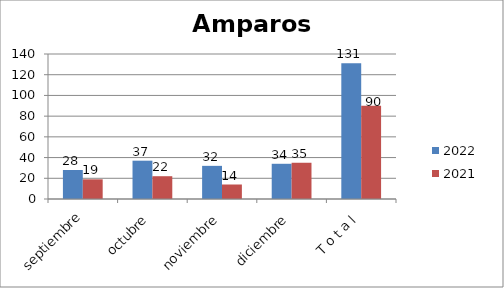
| Category | 2022 | 2021 |
|---|---|---|
| septiembre | 28 | 19 |
| octubre | 37 | 22 |
| noviembre | 32 | 14 |
| diciembre | 34 | 35 |
| T o t a l | 131 | 90 |